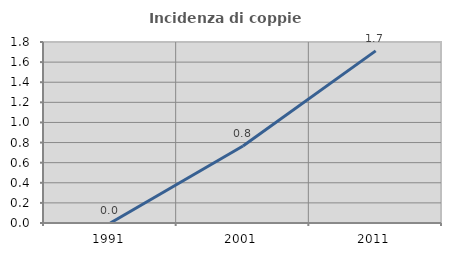
| Category | Incidenza di coppie miste |
|---|---|
| 1991.0 | 0 |
| 2001.0 | 0.765 |
| 2011.0 | 1.711 |